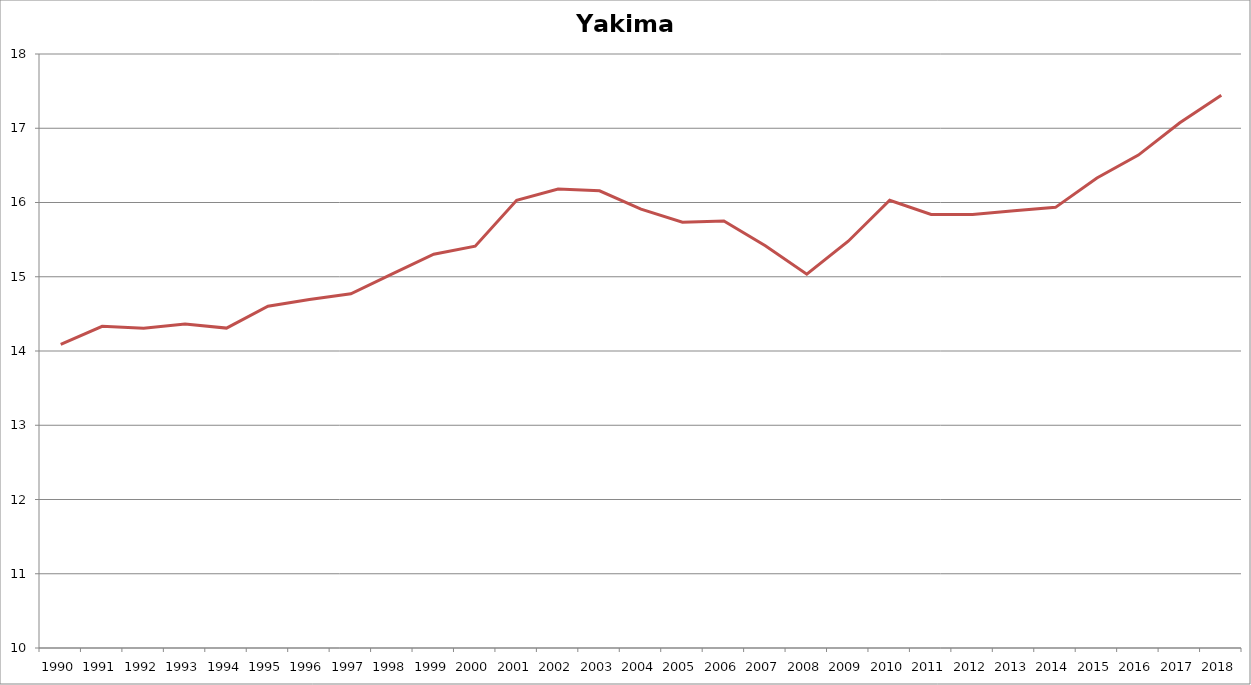
| Category | Yakima |
|---|---|
| 1990.0 | 14.09 |
| 1991.0 | 14.332 |
| 1992.0 | 14.308 |
| 1993.0 | 14.365 |
| 1994.0 | 14.309 |
| 1995.0 | 14.603 |
| 1996.0 | 14.692 |
| 1997.0 | 14.77 |
| 1998.0 | 15.038 |
| 1999.0 | 15.304 |
| 2000.0 | 15.411 |
| 2001.0 | 16.03 |
| 2002.0 | 16.18 |
| 2003.0 | 16.158 |
| 2004.0 | 15.911 |
| 2005.0 | 15.735 |
| 2006.0 | 15.752 |
| 2007.0 | 15.419 |
| 2008.0 | 15.034 |
| 2009.0 | 15.478 |
| 2010.0 | 16.031 |
| 2011.0 | 15.839 |
| 2012.0 | 15.838 |
| 2013.0 | 15.89 |
| 2014.0 | 15.935 |
| 2015.0 | 16.331 |
| 2016.0 | 16.639 |
| 2017.0 | 17.074 |
| 2018.0 | 17.446 |